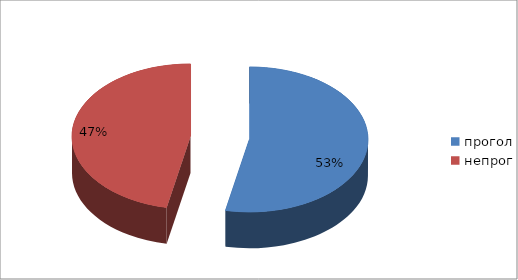
| Category | Series 0 |
|---|---|
| прогол | 33 |
| непрог | 29 |